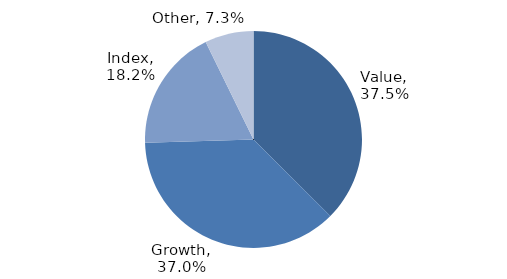
| Category | Investment Style |
|---|---|
| Value | 0.375 |
| Growth | 0.37 |
| Index | 0.182 |
| Other | 0.073 |